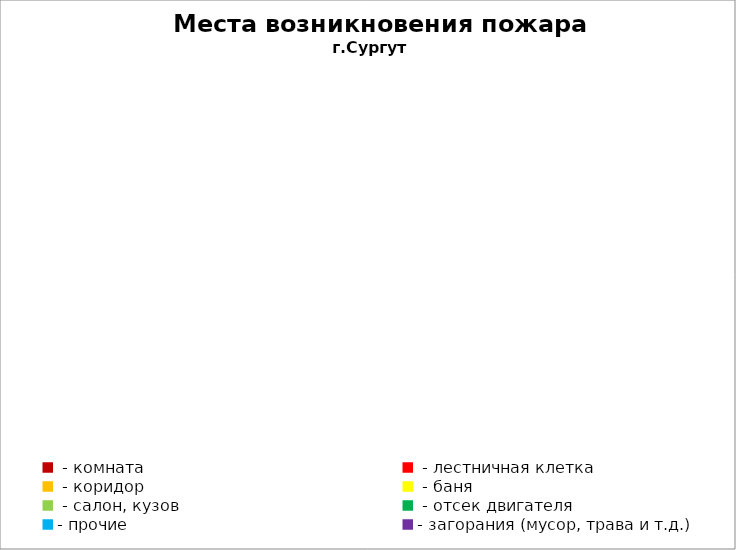
| Category | Места возникновения пожара |
|---|---|
|  - комната | 10 |
|  - лестничная клетка | 1 |
|  - коридор | 0 |
|  - баня | 2 |
|  - салон, кузов | 3 |
|  - отсек двигателя | 16 |
| - прочие | 45 |
| - загорания (мусор, трава и т.д.)  | 11 |